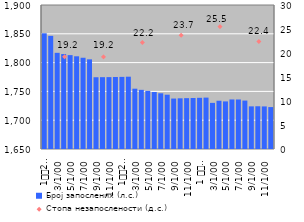
| Category | Број запослених (л.с.) |
|---|---|
| 1
2010. | 1850.871 |
| 2 | 1846.403 |
| 3 | 1816.959 |
| 4 | 1814.822 |
| 5 | 1812.985 |
| 6 | 1810.959 |
| 7 | 1808.408 |
| 8 | 1805.651 |
| 9 | 1774.589 |
| 10 | 1774.718 |
| 11 | 1774.807 |
| 12 | 1775.021 |
| 1
2011. | 1775.193 |
| 2 | 1775.529 |
| 3 | 1754.691 |
| 4 | 1752.702 |
| 5 | 1750.891 |
| 6 | 1748.953 |
| 7 | 1746.714 |
| 8 | 1744.262 |
| 9 | 1737.585 |
| 10 | 1737.998 |
| 11 | 1738.293 |
| 12 | 1738.544 |
| 1 
2012. | 1738.87 |
| 2 | 1739.224 |
| 3 | 1730.069 |
| 4 | 1733.762 |
| 5 | 1732.614 |
| 6 | 1736.017 |
| 7 | 1735.978 |
| 8 | 1734.074 |
| 9 | 1724.027 |
| 10 | 1724.214 |
| 11 | 1723.921 |
| 12 | 1722.794 |